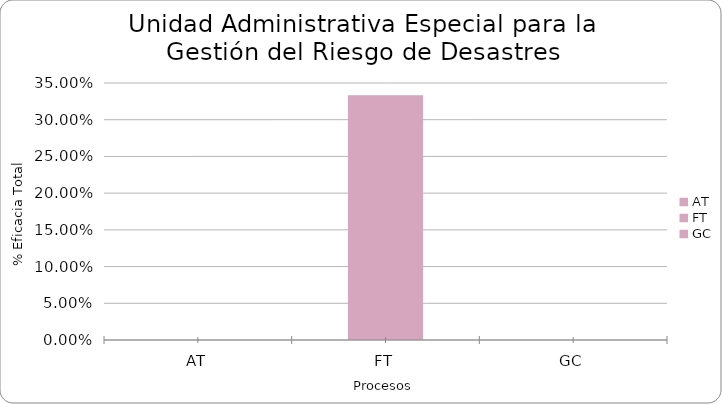
| Category | % Eficacia total |
|---|---|
| AT | 0 |
| FT | 0.333 |
| GC | 0 |